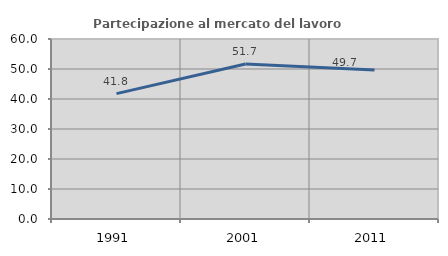
| Category | Partecipazione al mercato del lavoro  femminile |
|---|---|
| 1991.0 | 41.795 |
| 2001.0 | 51.661 |
| 2011.0 | 49.699 |